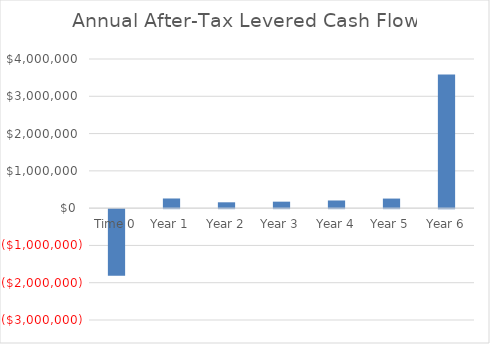
| Category | Series 0 |
|---|---|
| Time 0 | -1783187.5 |
| Year 1 | 259152.145 |
| Year 2 | 156554.296 |
| Year 3 | 173703.248 |
| Year 4 | 205651.859 |
| Year 5 | 256832.925 |
| Year 6 | 3585425.884 |